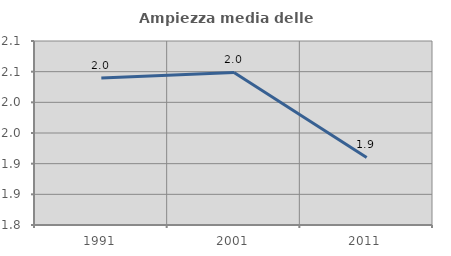
| Category | Ampiezza media delle famiglie |
|---|---|
| 1991.0 | 2.04 |
| 2001.0 | 2.049 |
| 2011.0 | 1.91 |